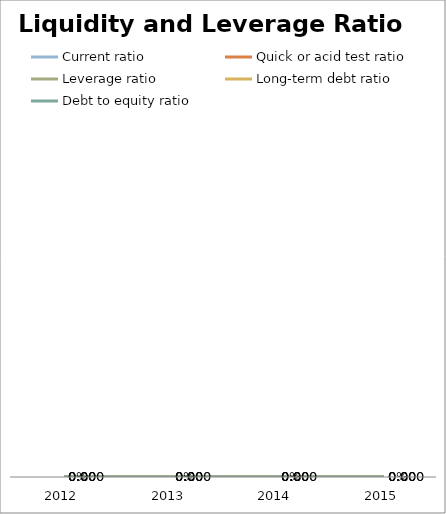
| Category | Current ratio | Quick or acid test ratio | Leverage ratio | Long-term debt ratio | Debt to equity ratio |
|---|---|---|---|---|---|
| 2012.0 | 0 | 0 | 0 | 0 | 0 |
| 2013.0 | 0 | 0 | 0 | 0 | 0 |
| 2014.0 | 0 | 0 | 0 | 0 | 0 |
| 2015.0 | 0 | 0 | 0 | 0 | 0 |